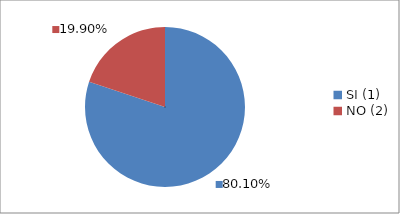
| Category | Series 0 |
|---|---|
| SI (1) | 0.801 |
| NO (2) | 0.199 |